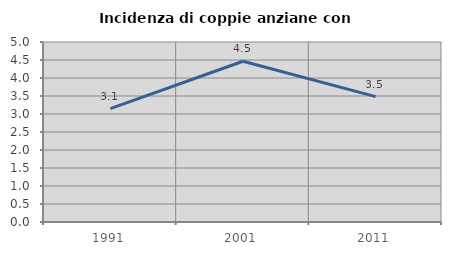
| Category | Incidenza di coppie anziane con figli |
|---|---|
| 1991.0 | 3.15 |
| 2001.0 | 4.465 |
| 2011.0 | 3.483 |